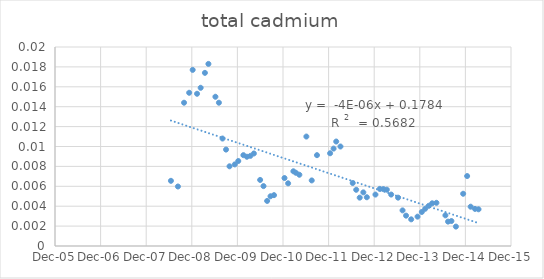
| Category | Series 0 |
|---|---|
| 39618.0 | 0.007 |
| 39674.0 | 0.006 |
| 39723.0 | 0.014 |
| 39764.0 | 0.015 |
| 39792.0 | 0.018 |
| 39827.0 | 0.015 |
| 39856.0 | 0.016 |
| 39890.0 | 0.017 |
| 39918.0 | 0.018 |
| 39974.0 | 0.015 |
| 40002.0 | 0.014 |
| 40031.0 | 0.011 |
| 40059.0 | 0.01 |
| 40087.0 | 0.008 |
| 40129.0 | 0.008 |
| 40157.0 | 0.009 |
| 40198.0 | 0.009 |
| 40226.0 | 0.009 |
| 40282.0 | 0.009 |
| 40254.0 | 0.009 |
| 40332.0 | 0.007 |
| 40359.0 | 0.006 |
| 40388.0 | 0.005 |
| 40415.0 | 0.005 |
| 40443.0 | 0.005 |
| 40527.0 | 0.007 |
| 40556.0 | 0.006 |
| 40598.0 | 0.008 |
| 40618.0 | 0.007 |
| 40646.0 | 0.007 |
| 40702.0 | 0.011 |
| 40745.0 | 0.007 |
| 40787.0 | 0.009 |
| 40892.0 | 0.009 |
| 40920.0 | 0.01 |
| 40941.0 | 0.01 |
| 40975.0 | 0.01 |
| 41073.0 | 0.006 |
| 41101.0 | 0.006 |
| 41129.0 | 0.005 |
| 41158.0 | 0.005 |
| 41186.0 | 0.005 |
| 41255.0 | 0.005 |
| 41290.0 | 0.006 |
| 41318.0 | 0.006 |
| 41346.0 | 0.006 |
| 41381.0 | 0.005 |
| 41436.0 | 0.005 |
| 41472.0 | 0.004 |
| 41500.0 | 0.003 |
| 41541.0 | 0.003 |
| 41592.0 | 0.003 |
| 41626.0 | 0.003 |
| 41653.0 | 0.004 |
| 41682.0 | 0.004 |
| 41709.0 | 0.004 |
| 41743.0 | 0.004 |
| 41815.0 | 0.003 |
| 41836.0 | 0.002 |
| 41863.0 | 0.003 |
| 41899.0 | 0.002 |
| 41957.0 | 0.005 |
| 41989.0 | 0.007 |
| 42017.0 | 0.004 |
| 42052.0 | 0.004 |
| 42080.0 | 0.004 |